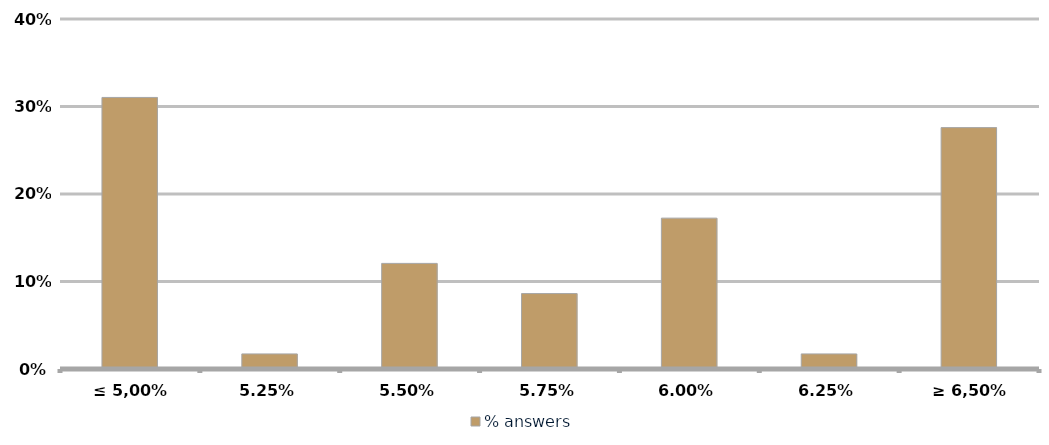
| Category | % answers |
|---|---|
| ≤ 5,00% | 0.31 |
| 5,25% | 0.017 |
| 5,50% | 0.121 |
| 5,75% | 0.086 |
| 6,00% | 0.172 |
| 6,25% | 0.017 |
| ≥ 6,50% | 0.276 |